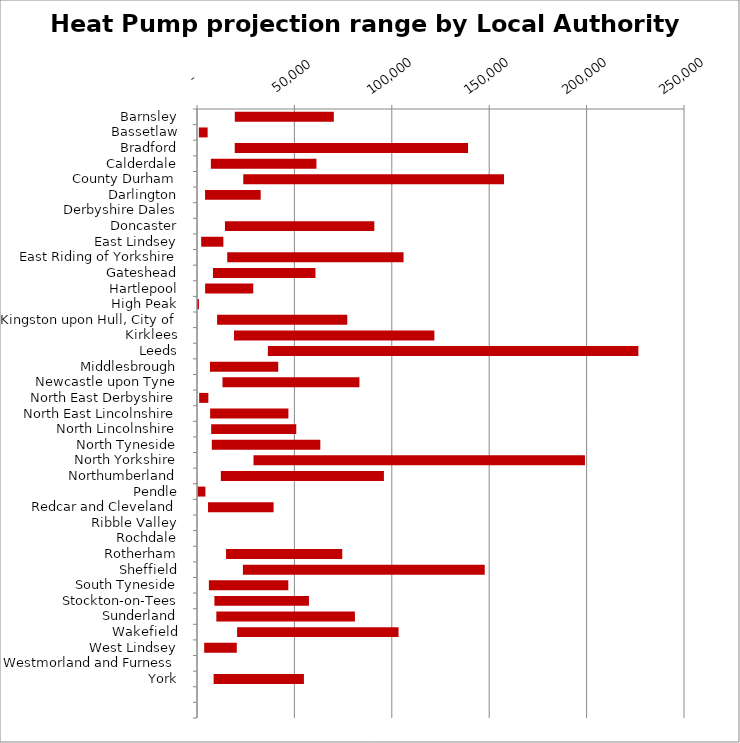
| Category | MIN | MAX |
|---|---|---|
| Barnsley | 19410 | 50828 |
| Bassetlaw | 959 | 4499 |
| Bradford | 19377 | 119768 |
| Calderdale | 7107 | 54207 |
| County Durham | 23751 | 133863 |
| Darlington | 4133 | 28545 |
| Derbyshire Dales | 14 | 63 |
| Doncaster | 14345 | 76685 |
| East Lindsey | 2139 | 11394 |
| East Riding of Yorkshire | 15515 | 90529 |
| Gateshead | 8190 | 52621 |
| Hartlepool | 4168 | 24705 |
| High Peak | 155 | 852 |
| Kingston upon Hull, City of | 10312 | 66837 |
| Kirklees | 18997 | 102860 |
| Leeds | 36369 | 190201 |
| Middlesbrough | 6649 | 35044 |
| Newcastle upon Tyne | 13077 | 70296 |
| North East Derbyshire | 1103 | 4725 |
| North East Lincolnshire | 6736 | 40188 |
| North Lincolnshire | 7281 | 43678 |
| North Tyneside | 7591 | 55721 |
| North Yorkshire | 29012 | 170145 |
| Northumberland | 12232 | 83721 |
| Pendle | 369 | 3955 |
| Redcar and Cleveland | 5665 | 33654 |
| Ribble Valley | 4 | 38 |
| Rochdale | 2 | 8 |
| Rotherham | 14906 | 59670 |
| Sheffield | 23564 | 124147 |
| South Tyneside | 6098 | 40783 |
| Stockton-on-Tees | 8931 | 48542 |
| Sunderland | 9931 | 71145 |
| Wakefield | 20588 | 82868 |
| West Lindsey | 3679 | 16753 |
| Westmorland and Furness | 1 | 6 |
| York | 8533 | 46355 |